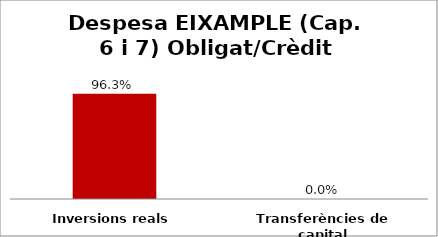
| Category | Series 0 |
|---|---|
| Inversions reals | 0.963 |
| Transferències de capital | 0 |